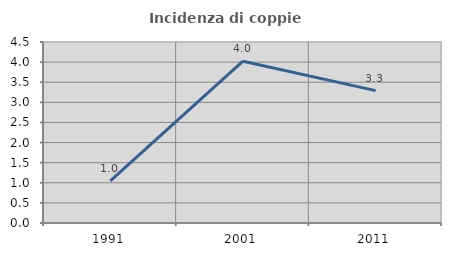
| Category | Incidenza di coppie miste |
|---|---|
| 1991.0 | 1.045 |
| 2001.0 | 4.022 |
| 2011.0 | 3.292 |